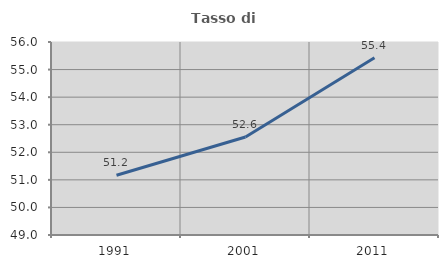
| Category | Tasso di occupazione   |
|---|---|
| 1991.0 | 51.166 |
| 2001.0 | 52.552 |
| 2011.0 | 55.428 |